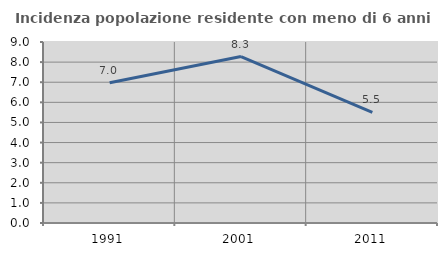
| Category | Incidenza popolazione residente con meno di 6 anni |
|---|---|
| 1991.0 | 6.971 |
| 2001.0 | 8.278 |
| 2011.0 | 5.499 |